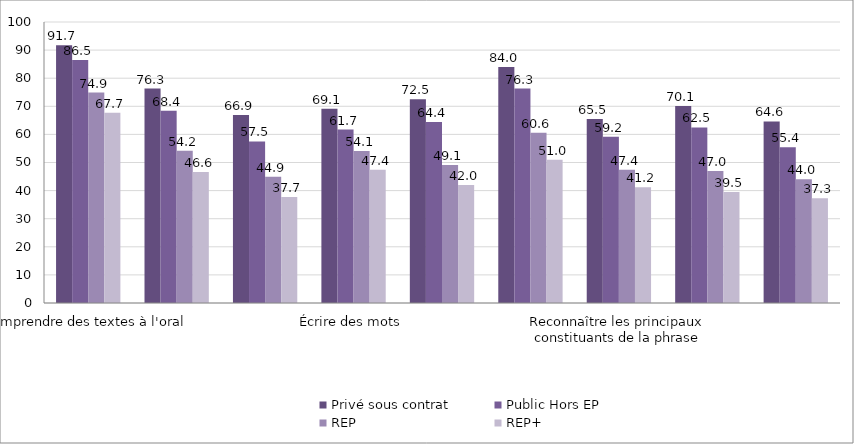
| Category | Privé sous contrat | Public Hors EP | REP | REP+ |
|---|---|---|---|---|
| Comprendre des textes à l'oral | 91.7 | 86.5 | 74.9 | 67.7 |
| Comprendre un texte lu seul(e) | 76.3 | 68.4 | 54.2 | 46.6 |
| Lire à voix haute un texte | 66.9 | 57.5 | 44.9 | 37.7 |
| Écrire des mots | 69.1 | 61.7 | 54.1 | 47.4 |
| Savoir trouver des synonymes | 72.5 | 64.4 | 49.1 | 42 |
| Savoir trouver des mots de la même famille | 84 | 76.3 | 60.6 | 51 |
| Reconnaître les principaux constituants de la phrase | 65.5 | 59.2 | 47.4 | 41.2 |
| Utiliser des marques d'accord pour les noms et adjectifs | 70.1 | 62.5 | 47 | 39.5 |
| Identifier la relation sujet - verbe | 64.6 | 55.4 | 44 | 37.3 |